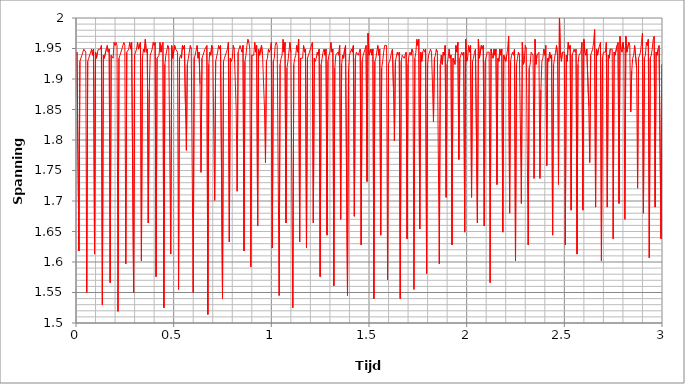
| Category | Series 0 |
|---|---|
| 0.0 | 1.939 |
| 0.005 | 1.944 |
| 0.01 | 1.944 |
| 0.015 | 1.618 |
| 0.02 | 1.929 |
| 0.025 | 1.929 |
| 0.03 | 1.939 |
| 0.035 | 1.944 |
| 0.04 | 1.949 |
| 0.045 | 1.949 |
| 0.05 | 1.944 |
| 0.055 | 1.55 |
| 0.06 | 1.929 |
| 0.065 | 1.934 |
| 0.07 | 1.934 |
| 0.075 | 1.944 |
| 0.08 | 1.949 |
| 0.085 | 1.939 |
| 0.09 | 1.949 |
| 0.095 | 1.613 |
| 0.1 | 1.944 |
| 0.105 | 1.934 |
| 0.11 | 1.944 |
| 0.115 | 1.949 |
| 0.12 | 1.949 |
| 0.125 | 1.949 |
| 0.13 | 1.955 |
| 0.135 | 1.53 |
| 0.14 | 1.939 |
| 0.145 | 1.934 |
| 0.15 | 1.934 |
| 0.155 | 1.949 |
| 0.16 | 1.955 |
| 0.165 | 1.944 |
| 0.17 | 1.949 |
| 0.175 | 1.566 |
| 0.18 | 1.939 |
| 0.185 | 1.939 |
| 0.19 | 1.934 |
| 0.195 | 1.96 |
| 0.2 | 1.955 |
| 0.205 | 1.96 |
| 0.21 | 1.955 |
| 0.215 | 1.519 |
| 0.22 | 1.934 |
| 0.225 | 1.939 |
| 0.23 | 1.944 |
| 0.235 | 1.949 |
| 0.24 | 1.955 |
| 0.245 | 1.96 |
| 0.25 | 1.955 |
| 0.255 | 1.597 |
| 0.26 | 1.944 |
| 0.265 | 1.944 |
| 0.27 | 1.949 |
| 0.275 | 1.96 |
| 0.28 | 1.949 |
| 0.285 | 1.96 |
| 0.29 | 1.96 |
| 0.295 | 1.55 |
| 0.3 | 1.939 |
| 0.305 | 1.944 |
| 0.31 | 1.949 |
| 0.315 | 1.96 |
| 0.32 | 1.949 |
| 0.325 | 1.949 |
| 0.33 | 1.96 |
| 0.335 | 1.602 |
| 0.34 | 1.934 |
| 0.345 | 1.949 |
| 0.35 | 1.944 |
| 0.355 | 1.965 |
| 0.36 | 1.944 |
| 0.365 | 1.949 |
| 0.37 | 1.664 |
| 0.375 | 1.882 |
| 0.38 | 1.939 |
| 0.385 | 1.944 |
| 0.39 | 1.949 |
| 0.395 | 1.96 |
| 0.4 | 1.955 |
| 0.405 | 1.96 |
| 0.41 | 1.576 |
| 0.415 | 1.934 |
| 0.42 | 1.934 |
| 0.425 | 1.939 |
| 0.43 | 1.96 |
| 0.435 | 1.944 |
| 0.44 | 1.955 |
| 0.445 | 1.96 |
| 0.45 | 1.525 |
| 0.455 | 1.924 |
| 0.46 | 1.939 |
| 0.465 | 1.939 |
| 0.47 | 1.955 |
| 0.475 | 1.949 |
| 0.48 | 1.949 |
| 0.485 | 1.613 |
| 0.49 | 1.955 |
| 0.495 | 1.934 |
| 0.5 | 1.934 |
| 0.505 | 1.955 |
| 0.51 | 1.949 |
| 0.515 | 1.949 |
| 0.52 | 1.944 |
| 0.525 | 1.555 |
| 0.53 | 1.934 |
| 0.535 | 1.939 |
| 0.54 | 1.934 |
| 0.545 | 1.955 |
| 0.55 | 1.949 |
| 0.555 | 1.955 |
| 0.56 | 1.861 |
| 0.565 | 1.783 |
| 0.57 | 1.924 |
| 0.575 | 1.934 |
| 0.58 | 1.944 |
| 0.585 | 1.955 |
| 0.59 | 1.949 |
| 0.595 | 1.949 |
| 0.6 | 1.55 |
| 0.605 | 1.934 |
| 0.61 | 1.939 |
| 0.615 | 1.939 |
| 0.62 | 1.955 |
| 0.625 | 1.934 |
| 0.63 | 1.944 |
| 0.635 | 1.892 |
| 0.64 | 1.747 |
| 0.645 | 1.934 |
| 0.65 | 1.939 |
| 0.655 | 1.944 |
| 0.66 | 1.949 |
| 0.665 | 1.949 |
| 0.67 | 1.955 |
| 0.675 | 1.514 |
| 0.68 | 1.924 |
| 0.685 | 1.944 |
| 0.69 | 1.939 |
| 0.695 | 1.955 |
| 0.7 | 1.949 |
| 0.705 | 1.949 |
| 0.71 | 1.701 |
| 0.715 | 1.929 |
| 0.72 | 1.929 |
| 0.725 | 1.944 |
| 0.73 | 1.955 |
| 0.735 | 1.949 |
| 0.74 | 1.955 |
| 0.745 | 1.955 |
| 0.75 | 1.54 |
| 0.755 | 1.929 |
| 0.76 | 1.934 |
| 0.765 | 1.939 |
| 0.77 | 1.944 |
| 0.775 | 1.949 |
| 0.78 | 1.96 |
| 0.785 | 1.633 |
| 0.79 | 1.934 |
| 0.795 | 1.929 |
| 0.8 | 1.934 |
| 0.805 | 1.955 |
| 0.81 | 1.949 |
| 0.815 | 1.949 |
| 0.82 | 1.851 |
| 0.825 | 1.716 |
| 0.83 | 1.944 |
| 0.835 | 1.944 |
| 0.84 | 1.955 |
| 0.845 | 1.949 |
| 0.85 | 1.944 |
| 0.855 | 1.955 |
| 0.86 | 1.618 |
| 0.865 | 1.929 |
| 0.87 | 1.939 |
| 0.875 | 1.955 |
| 0.88 | 1.965 |
| 0.885 | 1.96 |
| 0.89 | 1.949 |
| 0.895 | 1.592 |
| 0.9 | 1.939 |
| 0.905 | 1.939 |
| 0.91 | 1.939 |
| 0.915 | 1.96 |
| 0.92 | 1.944 |
| 0.925 | 1.955 |
| 0.93 | 1.659 |
| 0.935 | 1.949 |
| 0.94 | 1.939 |
| 0.945 | 1.939 |
| 0.95 | 1.955 |
| 0.955 | 1.939 |
| 0.96 | 1.939 |
| 0.965 | 1.851 |
| 0.97 | 1.763 |
| 0.975 | 1.929 |
| 0.98 | 1.934 |
| 0.985 | 1.949 |
| 0.99 | 1.944 |
| 0.995 | 1.949 |
| 1.0 | 1.96 |
| 1.005 | 1.623 |
| 1.01 | 1.929 |
| 1.015 | 1.934 |
| 1.02 | 1.955 |
| 1.025 | 1.96 |
| 1.03 | 1.955 |
| 1.035 | 1.955 |
| 1.04 | 1.545 |
| 1.045 | 1.924 |
| 1.05 | 1.934 |
| 1.055 | 1.939 |
| 1.06 | 1.965 |
| 1.065 | 1.944 |
| 1.07 | 1.96 |
| 1.075 | 1.664 |
| 1.08 | 1.918 |
| 1.085 | 1.929 |
| 1.09 | 1.944 |
| 1.095 | 1.96 |
| 1.1 | 1.944 |
| 1.105 | 1.944 |
| 1.11 | 1.525 |
| 1.115 | 1.924 |
| 1.12 | 1.934 |
| 1.125 | 1.939 |
| 1.13 | 1.955 |
| 1.135 | 1.944 |
| 1.14 | 1.965 |
| 1.145 | 1.633 |
| 1.15 | 1.934 |
| 1.155 | 1.934 |
| 1.16 | 1.934 |
| 1.165 | 1.955 |
| 1.17 | 1.944 |
| 1.175 | 1.949 |
| 1.18 | 1.623 |
| 1.185 | 1.934 |
| 1.19 | 1.939 |
| 1.195 | 1.944 |
| 1.2 | 1.949 |
| 1.205 | 1.949 |
| 1.21 | 1.96 |
| 1.215 | 1.664 |
| 1.22 | 1.934 |
| 1.225 | 1.929 |
| 1.23 | 1.934 |
| 1.235 | 1.944 |
| 1.24 | 1.939 |
| 1.245 | 1.949 |
| 1.25 | 1.576 |
| 1.255 | 1.924 |
| 1.26 | 1.934 |
| 1.265 | 1.944 |
| 1.27 | 1.949 |
| 1.275 | 1.939 |
| 1.28 | 1.949 |
| 1.285 | 1.644 |
| 1.29 | 1.929 |
| 1.295 | 1.939 |
| 1.3 | 1.944 |
| 1.305 | 1.96 |
| 1.31 | 1.944 |
| 1.315 | 1.949 |
| 1.32 | 1.561 |
| 1.325 | 1.918 |
| 1.33 | 1.939 |
| 1.335 | 1.939 |
| 1.34 | 1.944 |
| 1.345 | 1.939 |
| 1.35 | 1.955 |
| 1.355 | 1.67 |
| 1.36 | 1.924 |
| 1.365 | 1.939 |
| 1.37 | 1.934 |
| 1.375 | 1.949 |
| 1.38 | 1.955 |
| 1.385 | 1.955 |
| 1.39 | 1.545 |
| 1.395 | 1.913 |
| 1.4 | 1.939 |
| 1.405 | 1.944 |
| 1.41 | 1.949 |
| 1.415 | 1.944 |
| 1.42 | 1.955 |
| 1.425 | 1.675 |
| 1.43 | 1.934 |
| 1.435 | 1.944 |
| 1.44 | 1.944 |
| 1.445 | 1.939 |
| 1.45 | 1.944 |
| 1.455 | 1.949 |
| 1.46 | 1.628 |
| 1.465 | 1.929 |
| 1.47 | 1.939 |
| 1.475 | 1.944 |
| 1.48 | 1.949 |
| 1.485 | 1.955 |
| 1.49 | 1.732 |
| 1.495 | 1.975 |
| 1.5 | 1.939 |
| 1.505 | 1.939 |
| 1.51 | 1.949 |
| 1.515 | 1.939 |
| 1.52 | 1.949 |
| 1.525 | 1.54 |
| 1.53 | 1.929 |
| 1.535 | 1.934 |
| 1.54 | 1.934 |
| 1.545 | 1.955 |
| 1.55 | 1.939 |
| 1.555 | 1.949 |
| 1.56 | 1.644 |
| 1.565 | 1.918 |
| 1.57 | 1.929 |
| 1.575 | 1.944 |
| 1.58 | 1.955 |
| 1.585 | 1.955 |
| 1.59 | 1.955 |
| 1.595 | 1.571 |
| 1.6 | 1.924 |
| 1.605 | 1.929 |
| 1.61 | 1.934 |
| 1.615 | 1.944 |
| 1.62 | 1.949 |
| 1.625 | 1.887 |
| 1.63 | 1.799 |
| 1.635 | 1.929 |
| 1.64 | 1.929 |
| 1.645 | 1.944 |
| 1.65 | 1.939 |
| 1.655 | 1.944 |
| 1.66 | 1.54 |
| 1.665 | 1.929 |
| 1.67 | 1.939 |
| 1.675 | 1.939 |
| 1.68 | 1.934 |
| 1.685 | 1.939 |
| 1.69 | 1.944 |
| 1.695 | 1.638 |
| 1.7 | 1.924 |
| 1.705 | 1.939 |
| 1.71 | 1.944 |
| 1.715 | 1.939 |
| 1.72 | 1.949 |
| 1.725 | 1.944 |
| 1.73 | 1.555 |
| 1.735 | 1.934 |
| 1.74 | 1.944 |
| 1.745 | 1.965 |
| 1.75 | 1.955 |
| 1.755 | 1.965 |
| 1.76 | 1.654 |
| 1.765 | 1.944 |
| 1.77 | 1.929 |
| 1.775 | 1.944 |
| 1.78 | 1.949 |
| 1.785 | 1.944 |
| 1.79 | 1.949 |
| 1.795 | 1.581 |
| 1.8 | 1.924 |
| 1.805 | 1.939 |
| 1.81 | 1.939 |
| 1.815 | 1.949 |
| 1.82 | 1.944 |
| 1.825 | 1.892 |
| 1.83 | 1.83 |
| 1.835 | 1.934 |
| 1.84 | 1.939 |
| 1.845 | 1.949 |
| 1.85 | 1.944 |
| 1.855 | 1.944 |
| 1.86 | 1.597 |
| 1.865 | 1.924 |
| 1.87 | 1.939 |
| 1.875 | 1.924 |
| 1.88 | 1.944 |
| 1.885 | 1.939 |
| 1.89 | 1.955 |
| 1.895 | 1.706 |
| 1.9 | 1.924 |
| 1.905 | 1.934 |
| 1.91 | 1.949 |
| 1.915 | 1.934 |
| 1.92 | 1.939 |
| 1.925 | 1.628 |
| 1.93 | 1.934 |
| 1.935 | 1.934 |
| 1.94 | 1.924 |
| 1.945 | 1.955 |
| 1.95 | 1.944 |
| 1.955 | 1.96 |
| 1.96 | 1.768 |
| 1.965 | 1.934 |
| 1.97 | 1.934 |
| 1.975 | 1.944 |
| 1.98 | 1.939 |
| 1.985 | 1.944 |
| 1.99 | 1.649 |
| 1.995 | 1.965 |
| 2.0 | 1.929 |
| 2.005 | 1.934 |
| 2.01 | 1.955 |
| 2.015 | 1.944 |
| 2.02 | 1.955 |
| 2.025 | 1.706 |
| 2.03 | 1.929 |
| 2.035 | 1.934 |
| 2.04 | 1.944 |
| 2.045 | 1.949 |
| 2.05 | 1.949 |
| 2.055 | 1.664 |
| 2.06 | 1.965 |
| 2.065 | 1.934 |
| 2.07 | 1.934 |
| 2.075 | 1.955 |
| 2.08 | 1.949 |
| 2.085 | 1.955 |
| 2.09 | 1.659 |
| 2.095 | 1.929 |
| 2.1 | 1.929 |
| 2.105 | 1.944 |
| 2.11 | 1.944 |
| 2.115 | 1.944 |
| 2.12 | 1.566 |
| 2.125 | 1.949 |
| 2.13 | 1.939 |
| 2.135 | 1.934 |
| 2.14 | 1.949 |
| 2.145 | 1.939 |
| 2.15 | 1.949 |
| 2.155 | 1.727 |
| 2.16 | 1.934 |
| 2.165 | 1.929 |
| 2.17 | 1.949 |
| 2.175 | 1.939 |
| 2.18 | 1.949 |
| 2.185 | 1.649 |
| 2.19 | 1.939 |
| 2.195 | 1.939 |
| 2.2 | 1.929 |
| 2.205 | 1.939 |
| 2.21 | 1.949 |
| 2.215 | 1.97 |
| 2.22 | 1.68 |
| 2.225 | 1.929 |
| 2.23 | 1.939 |
| 2.235 | 1.944 |
| 2.24 | 1.939 |
| 2.245 | 1.949 |
| 2.25 | 1.602 |
| 2.255 | 1.924 |
| 2.26 | 1.934 |
| 2.265 | 1.944 |
| 2.27 | 1.939 |
| 2.275 | 1.939 |
| 2.28 | 1.696 |
| 2.285 | 1.96 |
| 2.29 | 1.924 |
| 2.295 | 1.929 |
| 2.3 | 1.955 |
| 2.305 | 1.949 |
| 2.31 | 1.949 |
| 2.315 | 1.628 |
| 2.32 | 1.918 |
| 2.325 | 1.924 |
| 2.33 | 1.944 |
| 2.335 | 1.944 |
| 2.34 | 1.939 |
| 2.345 | 1.737 |
| 2.35 | 1.965 |
| 2.355 | 1.924 |
| 2.36 | 1.939 |
| 2.365 | 1.939 |
| 2.37 | 1.944 |
| 2.375 | 1.737 |
| 2.38 | 1.882 |
| 2.385 | 1.929 |
| 2.39 | 1.934 |
| 2.395 | 1.949 |
| 2.4 | 1.939 |
| 2.405 | 1.955 |
| 2.41 | 1.758 |
| 2.415 | 1.934 |
| 2.42 | 1.929 |
| 2.425 | 1.944 |
| 2.43 | 1.934 |
| 2.435 | 1.939 |
| 2.44 | 1.644 |
| 2.445 | 1.924 |
| 2.45 | 1.934 |
| 2.455 | 1.944 |
| 2.46 | 1.955 |
| 2.465 | 1.939 |
| 2.47 | 1.727 |
| 2.475 | 2.006 |
| 2.48 | 1.939 |
| 2.485 | 1.929 |
| 2.49 | 1.944 |
| 2.495 | 1.944 |
| 2.5 | 1.944 |
| 2.505 | 1.628 |
| 2.51 | 1.939 |
| 2.515 | 1.929 |
| 2.52 | 1.96 |
| 2.525 | 1.949 |
| 2.53 | 1.955 |
| 2.535 | 1.685 |
| 2.54 | 1.939 |
| 2.545 | 1.939 |
| 2.55 | 1.949 |
| 2.555 | 1.944 |
| 2.56 | 1.949 |
| 2.565 | 1.613 |
| 2.57 | 1.924 |
| 2.575 | 1.939 |
| 2.58 | 1.939 |
| 2.585 | 1.944 |
| 2.59 | 1.96 |
| 2.595 | 1.685 |
| 2.6 | 1.965 |
| 2.605 | 1.944 |
| 2.61 | 1.939 |
| 2.615 | 1.949 |
| 2.62 | 1.949 |
| 2.625 | 1.856 |
| 2.63 | 1.763 |
| 2.635 | 1.939 |
| 2.64 | 1.944 |
| 2.645 | 1.949 |
| 2.65 | 1.96 |
| 2.655 | 1.981 |
| 2.66 | 1.69 |
| 2.665 | 1.949 |
| 2.67 | 1.939 |
| 2.675 | 1.949 |
| 2.68 | 1.949 |
| 2.685 | 1.96 |
| 2.69 | 1.602 |
| 2.695 | 1.934 |
| 2.7 | 1.944 |
| 2.705 | 1.944 |
| 2.71 | 1.944 |
| 2.715 | 1.96 |
| 2.72 | 1.69 |
| 2.725 | 1.939 |
| 2.73 | 1.934 |
| 2.735 | 1.949 |
| 2.74 | 1.949 |
| 2.745 | 1.949 |
| 2.75 | 1.638 |
| 2.755 | 1.944 |
| 2.76 | 1.939 |
| 2.765 | 1.939 |
| 2.77 | 1.955 |
| 2.775 | 1.96 |
| 2.78 | 1.696 |
| 2.785 | 1.97 |
| 2.79 | 1.949 |
| 2.795 | 1.944 |
| 2.8 | 1.96 |
| 2.805 | 1.949 |
| 2.81 | 1.67 |
| 2.815 | 1.97 |
| 2.82 | 1.944 |
| 2.825 | 1.944 |
| 2.83 | 1.96 |
| 2.835 | 1.955 |
| 2.84 | 1.846 |
| 2.845 | 1.913 |
| 2.85 | 1.934 |
| 2.855 | 1.939 |
| 2.86 | 1.955 |
| 2.865 | 1.955 |
| 2.87 | 1.918 |
| 2.875 | 1.721 |
| 2.88 | 1.934 |
| 2.885 | 1.939 |
| 2.89 | 1.944 |
| 2.895 | 1.96 |
| 2.9 | 1.975 |
| 2.905 | 1.68 |
| 2.91 | 1.934 |
| 2.915 | 1.939 |
| 2.92 | 1.96 |
| 2.925 | 1.955 |
| 2.93 | 1.965 |
| 2.935 | 1.607 |
| 2.94 | 1.934 |
| 2.945 | 1.939 |
| 2.95 | 1.949 |
| 2.955 | 1.965 |
| 2.96 | 1.97 |
| 2.965 | 1.69 |
| 2.97 | 1.944 |
| 2.975 | 1.939 |
| 2.98 | 1.949 |
| 2.985 | 1.955 |
| 2.99 | 1.955 |
| 2.995 | 1.638 |
| 3.0 | 1.924 |